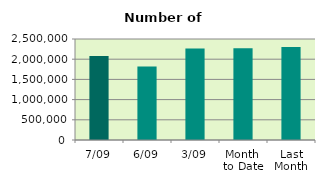
| Category | Series 0 |
|---|---|
| 7/09 | 2079954 |
| 6/09 | 1816242 |
| 3/09 | 2262626 |
| Month 
to Date | 2273385.6 |
| Last
Month | 2303894.727 |